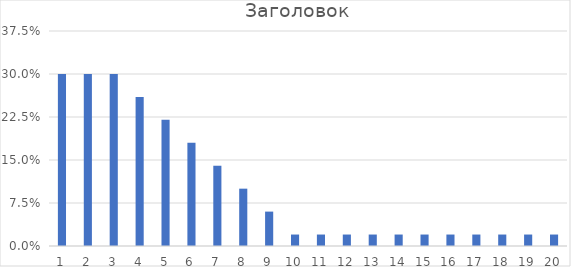
| Category | Series1 |
|---|---|
| 0 | 0.3 |
| 1 | 0.3 |
| 2 | 0.3 |
| 3 | 0.26 |
| 4 | 0.22 |
| 5 | 0.18 |
| 6 | 0.14 |
| 7 | 0.1 |
| 8 | 0.06 |
| 9 | 0.02 |
| 10 | 0.02 |
| 11 | 0.02 |
| 12 | 0.02 |
| 13 | 0.02 |
| 14 | 0.02 |
| 15 | 0.02 |
| 16 | 0.02 |
| 17 | 0.02 |
| 18 | 0.02 |
| 19 | 0.02 |